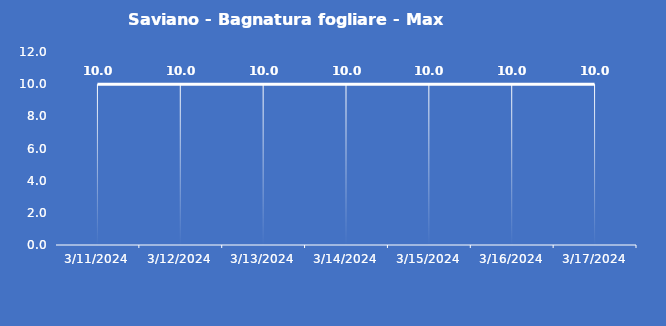
| Category | Saviano - Bagnatura fogliare - Max (min) |
|---|---|
| 3/11/24 | 10 |
| 3/12/24 | 10 |
| 3/13/24 | 10 |
| 3/14/24 | 10 |
| 3/15/24 | 10 |
| 3/16/24 | 10 |
| 3/17/24 | 10 |